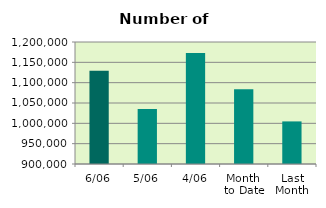
| Category | Series 0 |
|---|---|
| 6/06 | 1129028 |
| 5/06 | 1035150 |
| 4/06 | 1173100 |
| Month 
to Date | 1083925 |
| Last
Month | 1004730.273 |